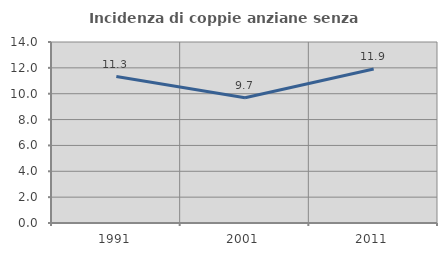
| Category | Incidenza di coppie anziane senza figli  |
|---|---|
| 1991.0 | 11.329 |
| 2001.0 | 9.684 |
| 2011.0 | 11.917 |